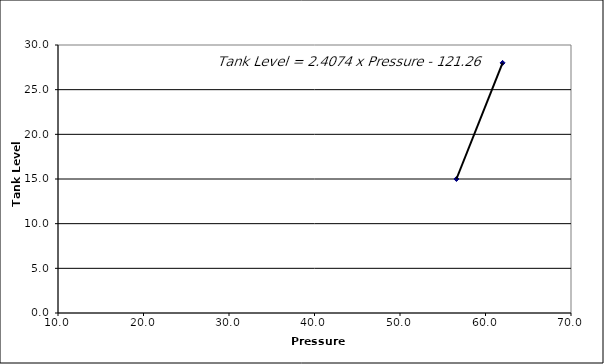
| Category | Series 0 |
|---|---|
| 62.0 | 28 |
| 56.6 | 15 |